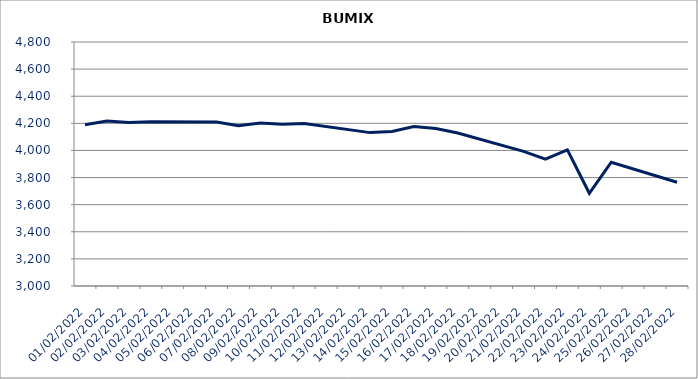
| Category | BUMIX |
|---|---|
| 01/02/2022 | 4189.4 |
| 02/02/2022 | 4217.95 |
| 03/02/2022 | 4206.58 |
| 04/02/2022 | 4211.13 |
| 07/02/2022 | 4209 |
| 08/02/2022 | 4183.07 |
| 09/02/2022 | 4202.77 |
| 10/02/2022 | 4194.07 |
| 11/02/2022 | 4199.2 |
| 14/02/2022 | 4131.52 |
| 15/02/2022 | 4140.47 |
| 16/02/2022 | 4177.18 |
| 17/02/2022 | 4161.67 |
| 18/02/2022 | 4128.63 |
| 21/02/2022 | 3993.64 |
| 22/02/2022 | 3936.35 |
| 23/02/2022 | 4004.05 |
| 24/02/2022 | 3684.09 |
| 25/02/2022 | 3912.97 |
| 28/02/2022 | 3765.1 |